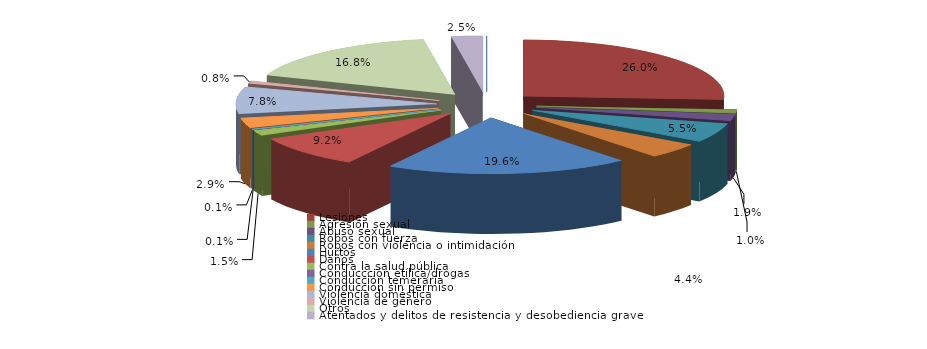
| Category | Series 0 |
|---|---|
| Homicidio/Asesinato dolosos | 0 |
| Lesiones | 207 |
| Agresión sexual | 8 |
| Abuso sexual | 15 |
| Robos con fuerza | 44 |
| Robos con violencia o intimidación | 35 |
| Hurtos | 156 |
| Daños | 73 |
| Contra la salud pública | 12 |
| Conduccción etílica/drogas | 1 |
| Conducción temeraria | 1 |
| Conducción sin permiso | 23 |
| Violencia doméstica | 62 |
| Violencia de género | 6 |
| Otros | 134 |
| Atentados y delitos de resistencia y desobediencia grave | 20 |
| Otros delitos contra el orden público | 0 |